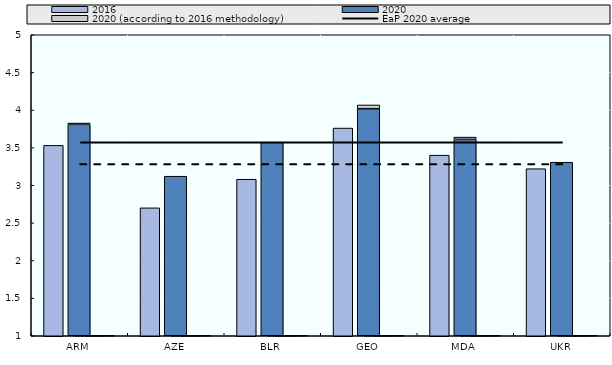
| Category | 2020 | Difference with 2020 according to 2016 methodology |
|---|---|---|
| ARM | 3.809 | 0.017 |
| AZE | 3.12 | 0 |
| BLR | 3.57 | 0 |
| GEO | 4.017 | 0.05 |
| MDA | 3.61 | 0.03 |
| UKR | 3.306 | 0 |